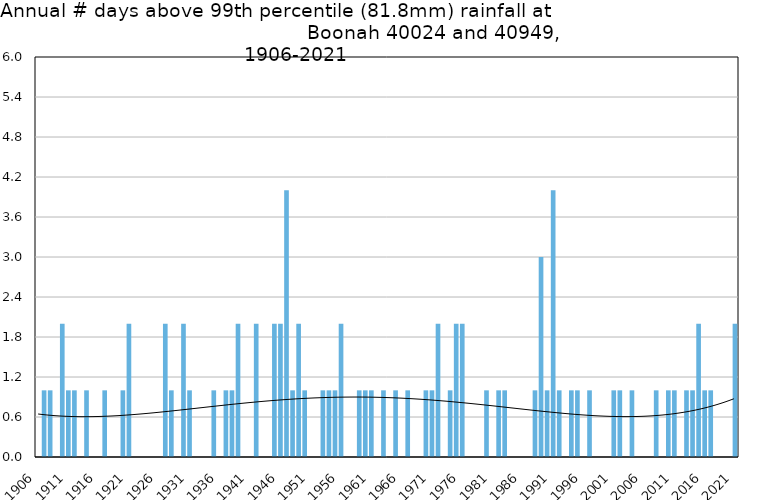
| Category | Annual # days above 99th percentile |
|---|---|
| 1906 | 0 |
| 1907 | 1 |
| 1908 | 1 |
| 1909 | 0 |
| 1910 | 2 |
| 1911 | 1 |
| 1912 | 1 |
| 1913 | 0 |
| 1914 | 1 |
| 1915 | 0 |
| 1916 | 0 |
| 1917 | 1 |
| 1918 | 0 |
| 1919 | 0 |
| 1920 | 1 |
| 1921 | 2 |
| 1922 | 0 |
| 1923 | 0 |
| 1924 | 0 |
| 1925 | 0 |
| 1926 | 0 |
| 1927 | 2 |
| 1928 | 1 |
| 1929 | 0 |
| 1930 | 2 |
| 1931 | 1 |
| 1932 | 0 |
| 1933 | 0 |
| 1934 | 0 |
| 1935 | 1 |
| 1936 | 0 |
| 1937 | 1 |
| 1938 | 1 |
| 1939 | 2 |
| 1940 | 0 |
| 1941 | 0 |
| 1942 | 2 |
| 1943 | 0 |
| 1944 | 0 |
| 1945 | 2 |
| 1946 | 2 |
| 1947 | 4 |
| 1948 | 1 |
| 1949 | 2 |
| 1950 | 1 |
| 1951 | 0 |
| 1952 | 0 |
| 1953 | 1 |
| 1954 | 1 |
| 1955 | 1 |
| 1956 | 2 |
| 1957 | 0 |
| 1958 | 0 |
| 1959 | 1 |
| 1960 | 1 |
| 1961 | 1 |
| 1962 | 0 |
| 1963 | 1 |
| 1964 | 0 |
| 1965 | 1 |
| 1966 | 0 |
| 1967 | 1 |
| 1968 | 0 |
| 1969 | 0 |
| 1970 | 1 |
| 1971 | 1 |
| 1972 | 2 |
| 1973 | 0 |
| 1974 | 1 |
| 1975 | 2 |
| 1976 | 2 |
| 1977 | 0 |
| 1978 | 0 |
| 1979 | 0 |
| 1980 | 1 |
| 1981 | 0 |
| 1982 | 1 |
| 1983 | 1 |
| 1984 | 0 |
| 1985 | 0 |
| 1986 | 0 |
| 1987 | 0 |
| 1988 | 1 |
| 1989 | 3 |
| 1990 | 1 |
| 1991 | 4 |
| 1992 | 1 |
| 1993 | 0 |
| 1994 | 1 |
| 1995 | 1 |
| 1996 | 0 |
| 1997 | 1 |
| 1998 | 0 |
| 1999 | 0 |
| 2000 | 0 |
| 2001 | 1 |
| 2002 | 1 |
| 2003 | 0 |
| 2004 | 1 |
| 2005 | 0 |
| 2006 | 0 |
| 2007 | 0 |
| 2008 | 1 |
| 2009 | 0 |
| 2010 | 1 |
| 2011 | 1 |
| 2012 | 0 |
| 2013 | 1 |
| 2014 | 1 |
| 2015 | 2 |
| 2016 | 1 |
| 2017 | 1 |
| 2018 | 0 |
| 2019 | 0 |
| 2020 | 0 |
| 2021 | 2 |